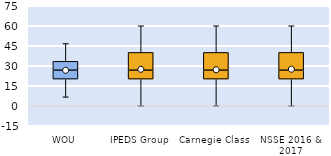
| Category | 25th | 50th | 75th |
|---|---|---|---|
| WOU | 20 | 6.667 | 6.667 |
| IPEDS Group | 20 | 6.667 | 13.333 |
| Carnegie Class | 20 | 6.667 | 13.333 |
| NSSE 2016 & 2017 | 20 | 6.667 | 13.333 |